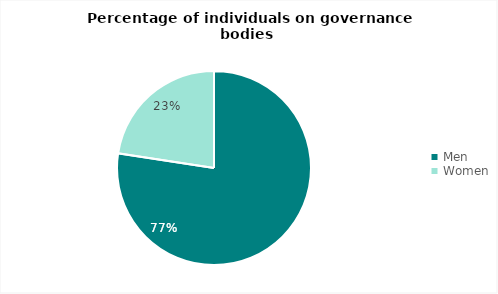
| Category | Series 0 |
|---|---|
| Men | 24 |
| Women | 7 |